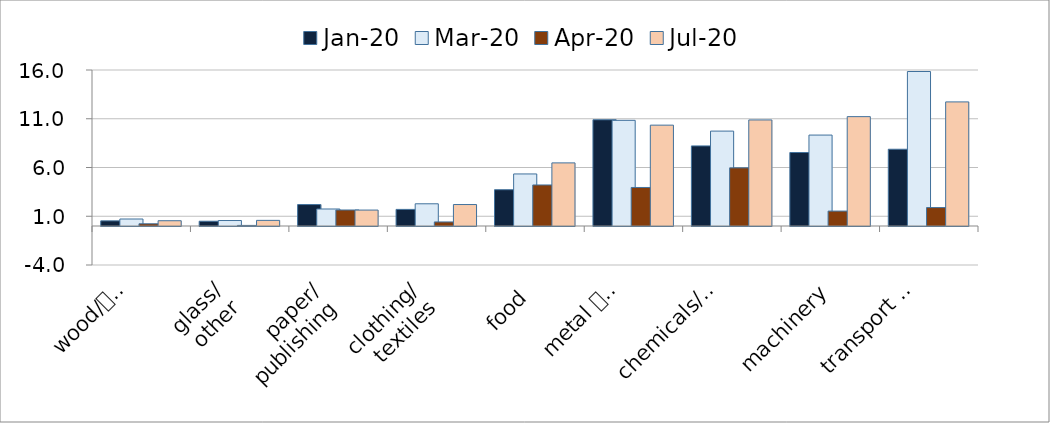
| Category | Jan-20 | Mar-20 | Apr-20 | Jul-20 |
|---|---|---|---|---|
| wood/
products | 0.528 | 0.717 | 0.227 | 0.541 |
| glass/
other | 0.489 | 0.561 | 0.06 | 0.578 |
| paper/
publishing | 2.199 | 1.744 | 1.641 | 1.635 |
| clothing/
textiles | 1.703 | 2.278 | 0.415 | 2.2 |
| food | 3.722 | 5.339 | 4.209 | 6.474 |
| metal 
products | 10.896 | 10.837 | 3.952 | 10.344 |
| chemicals/
plastic | 8.215 | 9.733 | 5.964 | 10.877 |
| machinery | 7.538 | 9.326 | 1.53 | 11.217 |
| transport 
eq. | 7.872 | 15.846 | 1.89 | 12.728 |